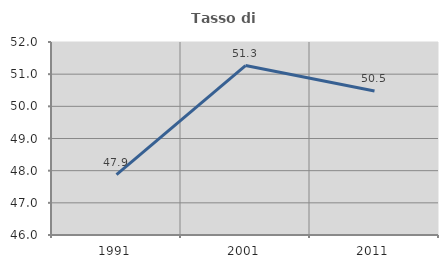
| Category | Tasso di occupazione   |
|---|---|
| 1991.0 | 47.878 |
| 2001.0 | 51.267 |
| 2011.0 | 50.478 |